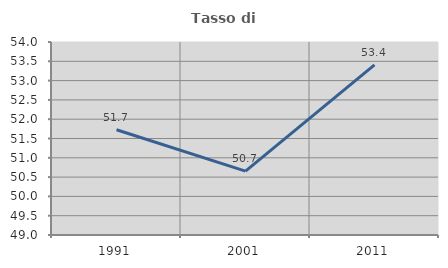
| Category | Tasso di occupazione   |
|---|---|
| 1991.0 | 51.726 |
| 2001.0 | 50.654 |
| 2011.0 | 53.408 |